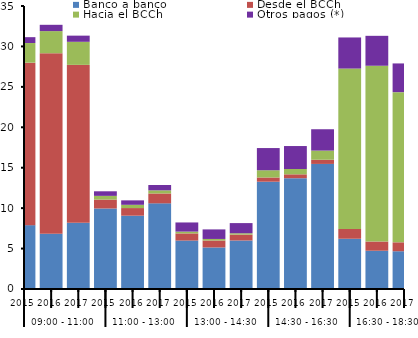
| Category | Banco a banco | Desde el BCCh | Hacia el BCCh | Otros pagos (*) |
|---|---|---|---|---|
| 0 | 7.898 | 20.093 | 2.429 | 0.726 |
| 1 | 6.831 | 22.328 | 2.736 | 0.779 |
| 2 | 8.184 | 19.533 | 2.854 | 0.764 |
| 3 | 9.957 | 1.102 | 0.46 | 0.565 |
| 4 | 9.065 | 0.945 | 0.404 | 0.55 |
| 5 | 10.593 | 1.224 | 0.386 | 0.657 |
| 6 | 5.991 | 0.883 | 0.223 | 1.132 |
| 7 | 5.138 | 0.861 | 0.19 | 1.181 |
| 8 | 5.998 | 0.728 | 0.168 | 1.257 |
| 9 | 13.268 | 0.522 | 0.895 | 2.745 |
| 10 | 13.702 | 0.48 | 0.658 | 2.842 |
| 11 | 15.468 | 0.519 | 1.132 | 2.638 |
| 12 | 6.214 | 1.209 | 19.841 | 3.846 |
| 13 | 4.733 | 1.137 | 21.741 | 3.701 |
| 14 | 4.671 | 1.102 | 18.572 | 3.553 |